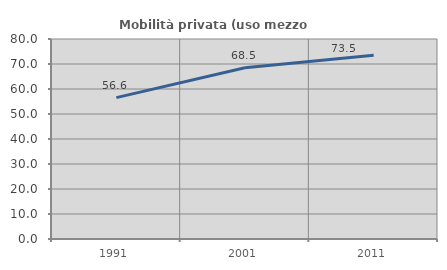
| Category | Mobilità privata (uso mezzo privato) |
|---|---|
| 1991.0 | 56.557 |
| 2001.0 | 68.52 |
| 2011.0 | 73.505 |